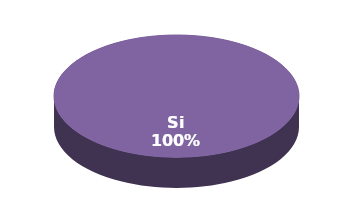
| Category | Series 1 |
|---|---|
| Si | 8 |